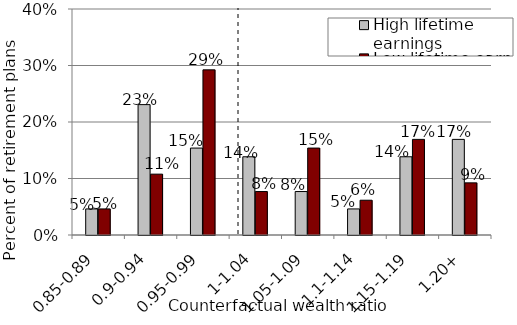
| Category | High lifetime earnings | Low lifetime earnings |
|---|---|---|
| 0.85-0.89 | 0.046 | 0.046 |
| 0.9-0.94 | 0.231 | 0.108 |
| 0.95-0.99 | 0.154 | 0.292 |
| 1-1.04 | 0.138 | 0.077 |
| 1.05-1.09 | 0.077 | 0.154 |
| 1.1-1.14 | 0.046 | 0.062 |
| 1.15-1.19 | 0.138 | 0.169 |
| 1.20+ | 0.169 | 0.092 |